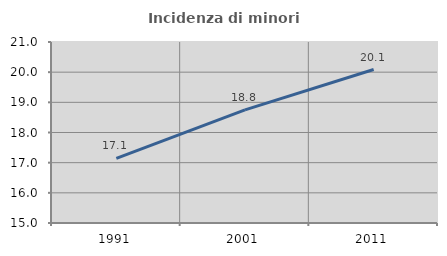
| Category | Incidenza di minori stranieri |
|---|---|
| 1991.0 | 17.143 |
| 2001.0 | 18.75 |
| 2011.0 | 20.088 |